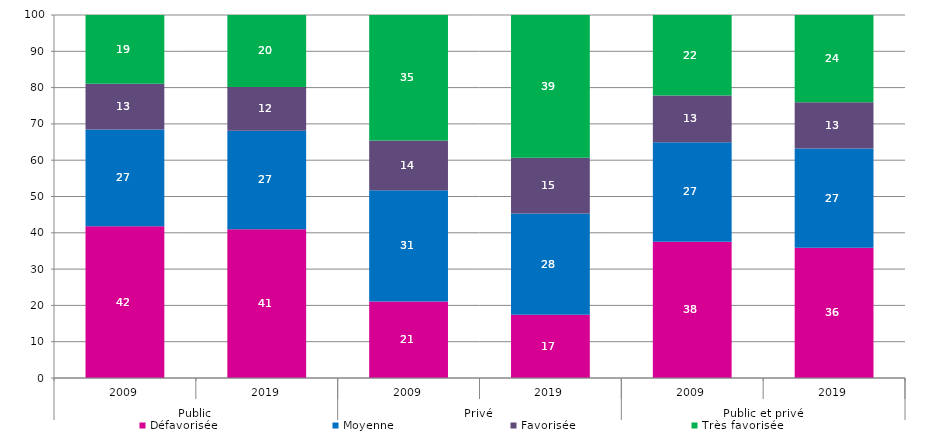
| Category | Défavorisée | Moyenne | Favorisée | Très favorisée |
|---|---|---|---|---|
| 0 | 41.82 | 26.62 | 12.6 | 18.97 |
| 1 | 40.989 | 27.141 | 12.042 | 19.828 |
| 2 | 21.1 | 30.59 | 13.75 | 34.56 |
| 3 | 17.423 | 27.902 | 15.344 | 39.331 |
| 4 | 37.53 | 27.44 | 12.84 | 22.19 |
| 5 | 35.897 | 27.306 | 12.756 | 24.042 |